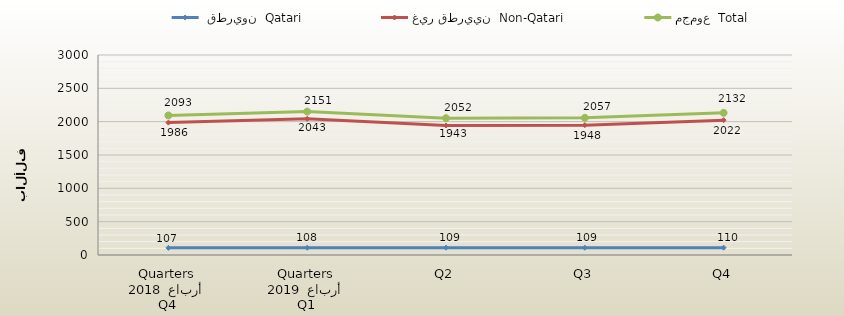
| Category |  قطريون  Qatari | غير قطريين  Non-Qatari | مجموع  Total |
|---|---|---|---|
| 0 | 107 | 1986 | 2093 |
| 1 | 108 | 2043 | 2151 |
| 2 | 109 | 1943 | 2052 |
| 3 | 109 | 1948 | 2057 |
| 4 | 110 | 2022 | 2132 |